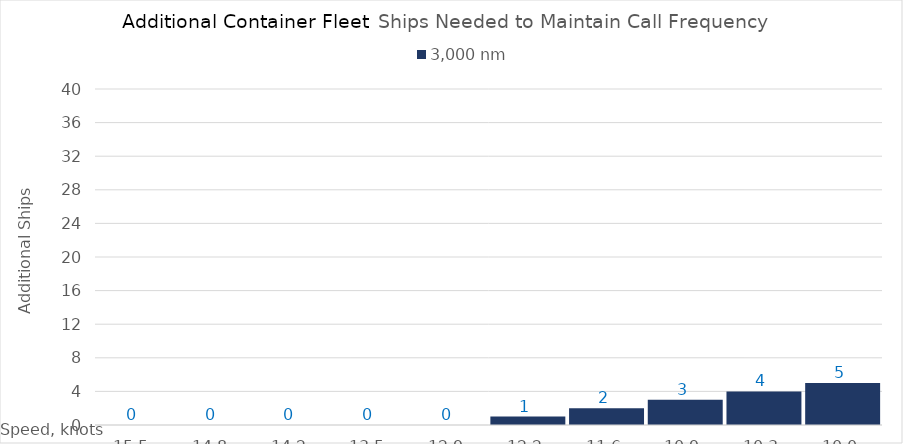
| Category | 3,000 |
|---|---|
| 15.450000000000001 | 0 |
| 14.8 | 0 |
| 14.15 | 0 |
| 13.5 | 0 |
| 12.85 | 0 |
| 12.2 | 1 |
| 11.549999999999999 | 2 |
| 10.899999999999999 | 3 |
| 10.249999999999998 | 4 |
| 10.0 | 5 |